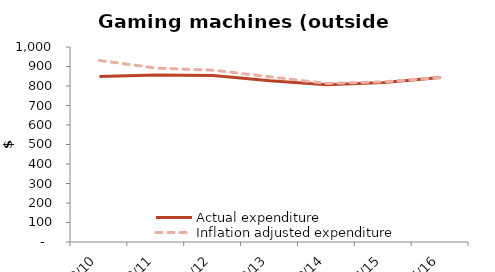
| Category | Actual expenditure | Inflation adjusted expenditure |
|---|---|---|
| 2009/10 | 849.163 | 931.065 |
| 2010/11 | 856.099 | 891.616 |
| 2011/12 | 853.954 | 881.006 |
| 2012/13 | 826.779 | 847.167 |
| 2013/14 | 806.271 | 813.018 |
| 2014/15 | 818.113 | 821.522 |
| 2015/16 | 843.482 | 843.482 |